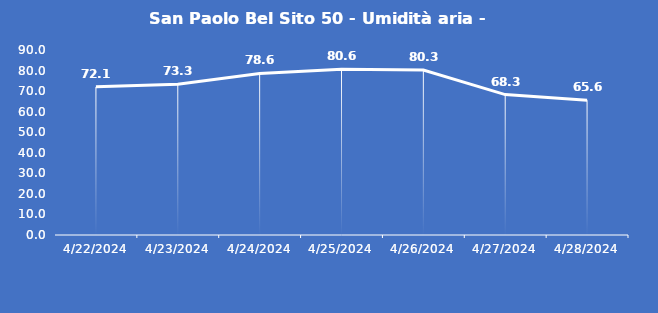
| Category | San Paolo Bel Sito 50 - Umidità aria - Grezzo (%) |
|---|---|
| 4/22/24 | 72.1 |
| 4/23/24 | 73.3 |
| 4/24/24 | 78.6 |
| 4/25/24 | 80.6 |
| 4/26/24 | 80.3 |
| 4/27/24 | 68.3 |
| 4/28/24 | 65.6 |